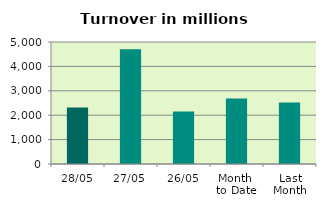
| Category | Series 0 |
|---|---|
| 28/05 | 2315.283 |
| 27/05 | 4707.438 |
| 26/05 | 2152.843 |
| Month 
to Date | 2685.462 |
| Last
Month | 2525.558 |